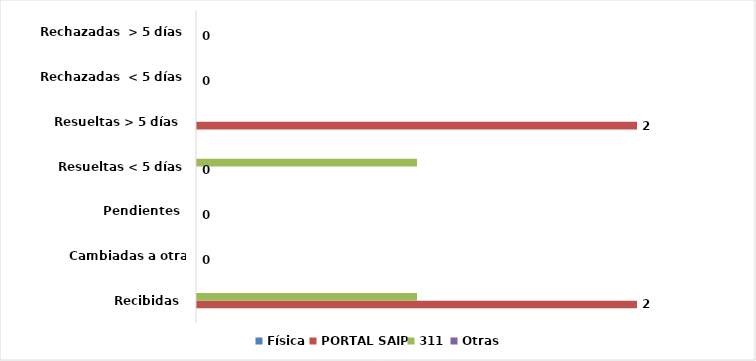
| Category | Física | PORTAL SAIP | 311 | Otras |
|---|---|---|---|---|
| Recibidas  | 0 | 2 | 1 | 0 |
| Cambiadas a otra institución | 0 | 0 | 0 | 0 |
| Pendientes  | 0 | 0 | 0 | 0 |
| Resueltas < 5 días | 0 | 0 | 1 | 0 |
| Resueltas > 5 días  | 0 | 2 | 0 | 0 |
| Rechazadas  < 5 días | 0 | 0 | 0 | 0 |
| Rechazadas  > 5 días | 0 | 0 | 0 | 0 |